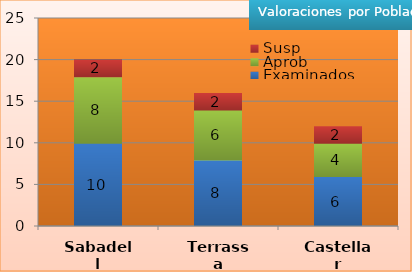
| Category | Examinados | Aprob | Susp |
|---|---|---|---|
| Sabadell | 10 | 8 | 2 |
| Terrassa | 8 | 6 | 2 |
| Castellar | 6 | 4 | 2 |